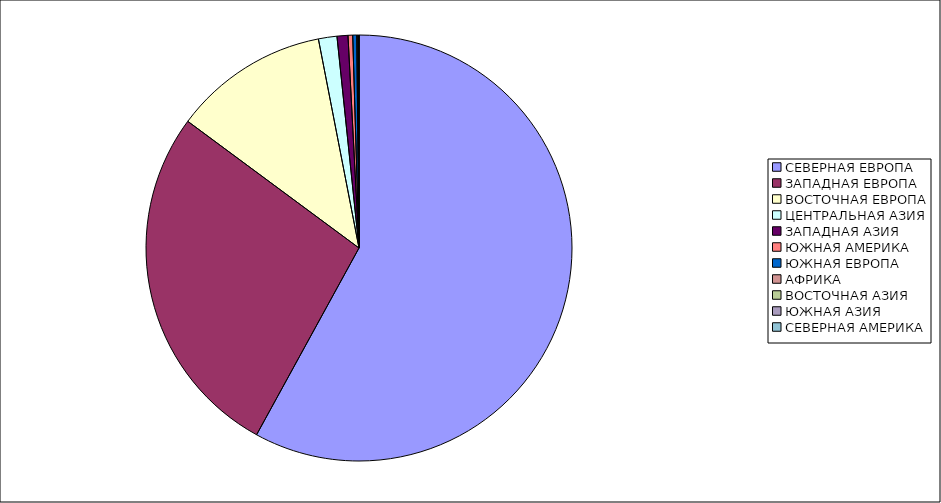
| Category | Оборот |
|---|---|
| СЕВЕРНАЯ ЕВРОПА | 57.984 |
| ЗАПАДНАЯ ЕВРОПА | 27.154 |
| ВОСТОЧНАЯ ЕВРОПА | 11.807 |
| ЦЕНТРАЛЬНАЯ АЗИЯ | 1.403 |
| ЗАПАДНАЯ АЗИЯ | 0.828 |
| ЮЖНАЯ АМЕРИКА | 0.353 |
| ЮЖНАЯ ЕВРОПА | 0.302 |
| АФРИКА | 0.077 |
| ВОСТОЧНАЯ АЗИЯ | 0.063 |
| ЮЖНАЯ АЗИЯ | 0.028 |
| СЕВЕРНАЯ АМЕРИКА | 0 |